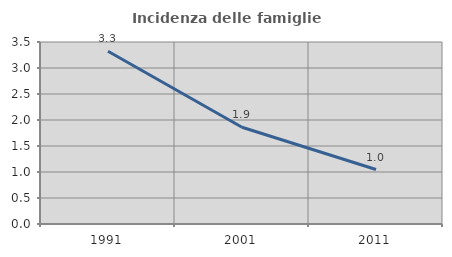
| Category | Incidenza delle famiglie numerose |
|---|---|
| 1991.0 | 3.321 |
| 2001.0 | 1.86 |
| 2011.0 | 1.047 |